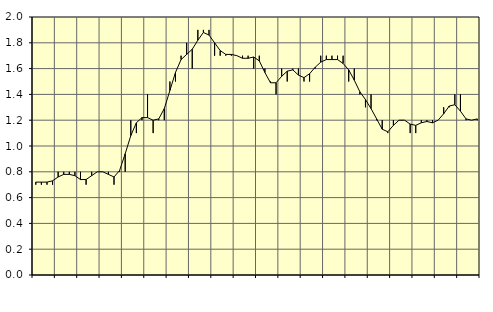
| Category | Piggar | Anställda utomlands |
|---|---|---|
| nan | 0.7 | 0.72 |
| 1.0 | 0.7 | 0.72 |
| 1.0 | 0.7 | 0.72 |
| 1.0 | 0.7 | 0.73 |
| nan | 0.8 | 0.76 |
| 2.0 | 0.8 | 0.78 |
| 2.0 | 0.8 | 0.78 |
| 2.0 | 0.8 | 0.77 |
| nan | 0.8 | 0.74 |
| 3.0 | 0.7 | 0.74 |
| 3.0 | 0.8 | 0.77 |
| 3.0 | 0.8 | 0.8 |
| nan | 0.8 | 0.8 |
| 4.0 | 0.8 | 0.78 |
| 4.0 | 0.7 | 0.76 |
| 4.0 | 0.8 | 0.81 |
| nan | 0.8 | 0.94 |
| 5.0 | 1.2 | 1.08 |
| 5.0 | 1.1 | 1.18 |
| 5.0 | 1.2 | 1.22 |
| nan | 1.4 | 1.22 |
| 6.0 | 1.1 | 1.2 |
| 6.0 | 1.2 | 1.21 |
| 6.0 | 1.2 | 1.29 |
| nan | 1.5 | 1.43 |
| 7.0 | 1.5 | 1.57 |
| 7.0 | 1.7 | 1.67 |
| 7.0 | 1.8 | 1.71 |
| nan | 1.6 | 1.75 |
| 8.0 | 1.9 | 1.82 |
| 8.0 | 1.9 | 1.88 |
| 8.0 | 1.9 | 1.86 |
| nan | 1.7 | 1.8 |
| 9.0 | 1.7 | 1.74 |
| 9.0 | 1.7 | 1.71 |
| 9.0 | 1.7 | 1.71 |
| nan | 1.7 | 1.7 |
| 10.0 | 1.7 | 1.68 |
| 10.0 | 1.7 | 1.68 |
| 10.0 | 1.6 | 1.69 |
| nan | 1.7 | 1.66 |
| 11.0 | 1.6 | 1.57 |
| 11.0 | 1.5 | 1.49 |
| 11.0 | 1.4 | 1.49 |
| nan | 1.6 | 1.54 |
| 12.0 | 1.5 | 1.58 |
| 12.0 | 1.6 | 1.59 |
| 12.0 | 1.6 | 1.55 |
| nan | 1.5 | 1.53 |
| 13.0 | 1.5 | 1.56 |
| 13.0 | 1.6 | 1.61 |
| 13.0 | 1.7 | 1.65 |
| nan | 1.7 | 1.67 |
| 14.0 | 1.7 | 1.67 |
| 14.0 | 1.7 | 1.67 |
| 14.0 | 1.7 | 1.64 |
| nan | 1.5 | 1.59 |
| 15.0 | 1.6 | 1.51 |
| 15.0 | 1.4 | 1.42 |
| 15.0 | 1.3 | 1.36 |
| nan | 1.4 | 1.29 |
| 16.0 | 1.2 | 1.21 |
| 16.0 | 1.2 | 1.13 |
| 16.0 | 1.1 | 1.11 |
| nan | 1.2 | 1.16 |
| 17.0 | 1.2 | 1.2 |
| 17.0 | 1.2 | 1.2 |
| 17.0 | 1.1 | 1.17 |
| nan | 1.1 | 1.16 |
| 18.0 | 1.2 | 1.18 |
| 18.0 | 1.2 | 1.19 |
| 18.0 | 1.2 | 1.18 |
| nan | 1.2 | 1.2 |
| 19.0 | 1.3 | 1.25 |
| 19.0 | 1.3 | 1.31 |
| 19.0 | 1.4 | 1.32 |
| nan | 1.4 | 1.27 |
| 20.0 | 1.2 | 1.21 |
| 20.0 | 1.2 | 1.2 |
| 20.0 | 1.2 | 1.21 |